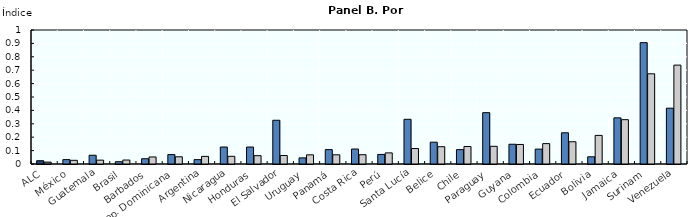
| Category | 2000 | 2015 |
|---|---|---|
| ALC | 0.024 | 0.014 |
| México | 0.033 | 0.028 |
| Guatemala | 0.065 | 0.029 |
| Brasil | 0.017 | 0.03 |
| Barbados | 0.039 | 0.053 |
| Rep. Dominicana | 0.07 | 0.054 |
| Argentina | 0.033 | 0.057 |
| Nicaragua | 0.127 | 0.057 |
| Honduras | 0.127 | 0.062 |
| El Salvador | 0.326 | 0.063 |
| Uruguay | 0.046 | 0.068 |
| Panamá | 0.107 | 0.069 |
| Costa Rica | 0.112 | 0.069 |
| Perú | 0.071 | 0.083 |
| Santa Lucía | 0.334 | 0.115 |
| Belice | 0.163 | 0.129 |
| Chile | 0.107 | 0.13 |
| Paraguay | 0.383 | 0.132 |
| Guyana | 0.147 | 0.146 |
| Colombia | 0.111 | 0.152 |
| Ecuador | 0.233 | 0.166 |
| Bolivia | 0.054 | 0.213 |
| Jamaica | 0.344 | 0.331 |
| Surinam | 0.906 | 0.673 |
| Venezuela | 0.416 | 0.738 |